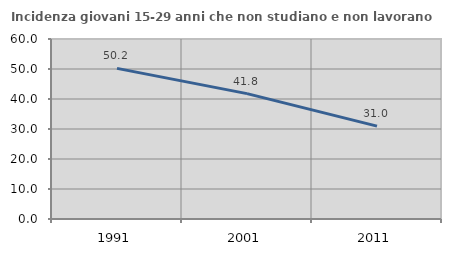
| Category | Incidenza giovani 15-29 anni che non studiano e non lavorano  |
|---|---|
| 1991.0 | 50.216 |
| 2001.0 | 41.787 |
| 2011.0 | 30.962 |